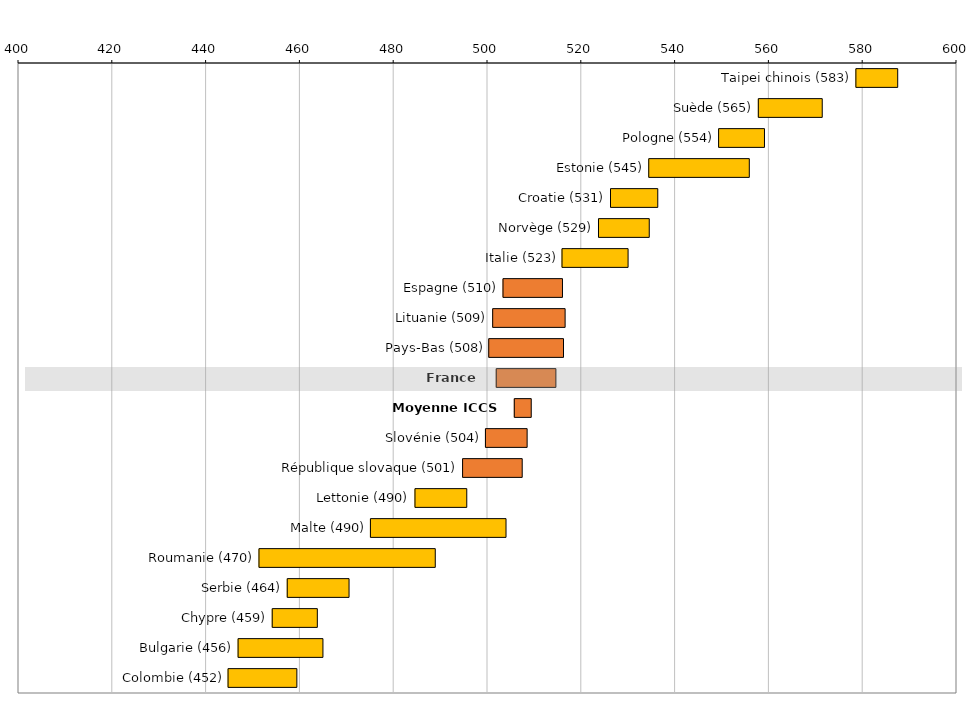
| Category | Series 0 | Series 1 |
|---|---|---|
| Taipei chinois (583) | 578.547 | 9.026 |
| Suède (565) | 557.744 | 13.737 |
| Pologne (554) | 549.276 | 9.887 |
| Estonie (545) | 534.38 | 21.547 |
| Croatie (531) | 526.227 | 10.183 |
| Norvège (529) | 523.665 | 10.931 |
| Italie (523) | 515.888 | 14.196 |
| Espagne (510) | 503.308 | 12.787 |
| Lituanie (509) | 501.106 | 15.549 |
| Pays-Bas (508) | 500.266 | 16.047 |
| France (508) | 501.862 | 12.829 |
| Moyenne ICCS (508) | 505.713 | 3.721 |
| Slovénie (504) | 499.562 | 8.993 |
| République slovaque (501) | 494.689 | 12.82 |
| Lettonie (490) | 484.536 | 11.151 |
| Malte (490) | 475.037 | 29.019 |
| Roumanie (470) | 451.276 | 37.695 |
| Serbie (464) | 457.3 | 13.286 |
| Chypre (459) | 454.099 | 9.725 |
| Bulgarie (456) | 446.821 | 18.2 |
| Colombie (452) | 444.681 | 14.78 |